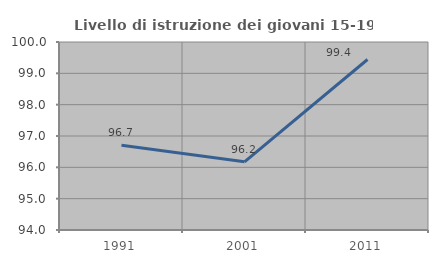
| Category | Livello di istruzione dei giovani 15-19 anni |
|---|---|
| 1991.0 | 96.703 |
| 2001.0 | 96.176 |
| 2011.0 | 99.441 |